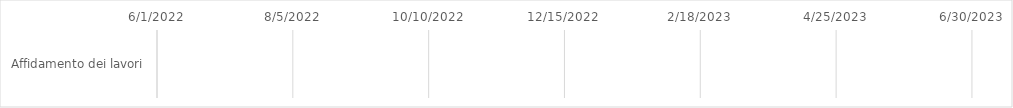
| Category | inizio | durata (gg) | fine |
|---|---|---|---|
| Affidamento dei lavori | 0 | 0 | 0 |